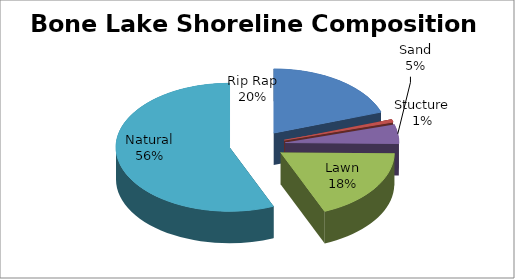
| Category | Series 0 |
|---|---|
| Rip Rap | 14555 |
| Stucture | 528 |
| Sand | 3558 |
| Lawn | 13616 |
| Natural | 41614 |